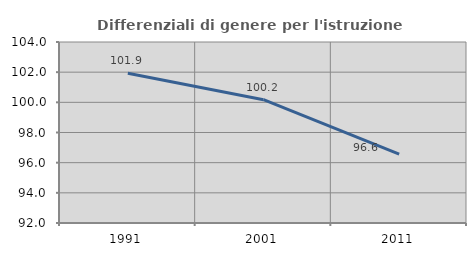
| Category | Differenziali di genere per l'istruzione superiore |
|---|---|
| 1991.0 | 101.931 |
| 2001.0 | 100.173 |
| 2011.0 | 96.569 |